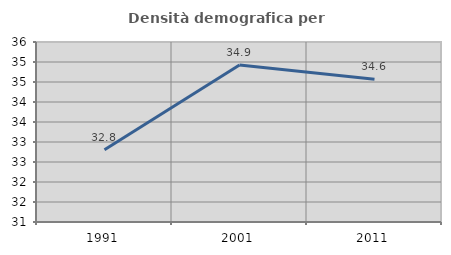
| Category | Densità demografica |
|---|---|
| 1991.0 | 32.808 |
| 2001.0 | 34.924 |
| 2011.0 | 34.568 |